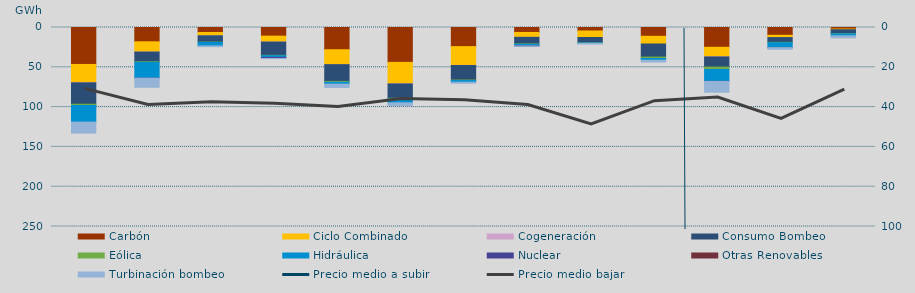
| Category | Carbón | Ciclo Combinado | Cogeneración | Consumo Bombeo | Eólica | Hidráulica | Nuclear | Otras Renovables | Turbinación bombeo |
|---|---|---|---|---|---|---|---|---|---|
| 0 | 46429 | 22875.8 | 230 | 26858.5 | 1566 | 20878.9 | 0 | 0 | 13810.2 |
| 1 | 17956.2 | 12815.5 | 103.4 | 12162.2 | 688.3 | 19850.2 | 66 | 0 | 11430.1 |
| 2 | 6283.8 | 4145.3 | 18.9 | 7977.8 | 313 | 4389.8 | 0 | 0 | 935.6 |
| 3 | 10864.5 | 7378.2 | 88.1 | 16621.4 | 464.4 | 2067.3 | 1381.8 | 0 | 160.4 |
| 4 | 27924.7 | 18737.8 | 26.5 | 21039.7 | 1083.3 | 2318.1 | 0 | 0 | 4314 |
| 5 | 43819.1 | 26947.4 | 131.4 | 18038.2 | 700.3 | 5037 | 0 | 0 | 3400 |
| 6 | 23995.8 | 23603.4 | 120.4 | 18312.9 | 630.7 | 2095.3 | 0 | 0 | 1288.4 |
| 7 | 6238.1 | 6107.2 | 11.4 | 8233.1 | 466.1 | 1774.5 | 300.5 | 0 | 185 |
| 8 | 4345.4 | 8205.3 | 0 | 6736.7 | 204.5 | 506 | 0 | 0 | 802.1 |
| 9 | 11031.5 | 9660.7 | 0 | 16502.5 | 1775.9 | 2151.2 | 0 | 0 | 2234.6 |
| 10 | 24843.5 | 12025 | 139.2 | 12696.1 | 3036.8 | 14862.1 | 109.8 | 0 | 13649 |
| 11 | 9788.3 | 2896.9 | 13 | 5978.6 | 470.2 | 6144.5 | 0 | 2 | 2006.5 |
| 12 | 1915.7 | 883.7 | 0 | 4789.3 | 395.2 | 2417.8 | 0 | 0 | 2598.3 |